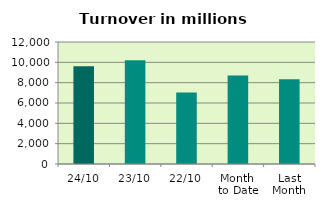
| Category | Series 0 |
|---|---|
| 24/10 | 9626.485 |
| 23/10 | 10197.886 |
| 22/10 | 7042.489 |
| Month 
to Date | 8707.285 |
| Last
Month | 8346.546 |